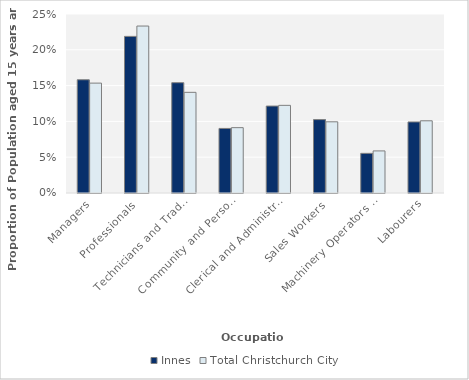
| Category | Innes | Total Christchurch City |
|---|---|---|
| Managers | 0.158 | 0.153 |
| Professionals | 0.219 | 0.233 |
| Technicians and Trades Workers | 0.154 | 0.141 |
| Community and Personal Service Workers | 0.09 | 0.091 |
| Clerical and Administrative Workers | 0.121 | 0.122 |
| Sales Workers | 0.103 | 0.099 |
| Machinery Operators and Drivers | 0.055 | 0.059 |
| Labourers | 0.099 | 0.101 |